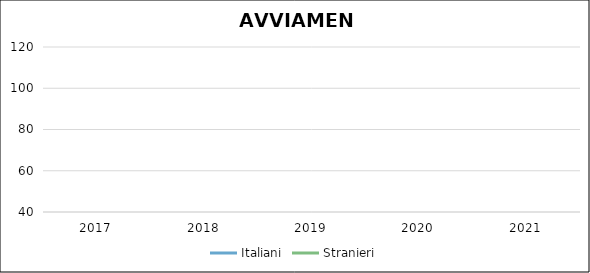
| Category | Italiani | Stranieri |
|---|---|---|
| 2017.0 | 0 | 0 |
| 2018.0 | 0 | 0 |
| 2019.0 | 0 | 0 |
| 2020.0 | 0 | 0 |
| 2021.0 | 0 | 0 |